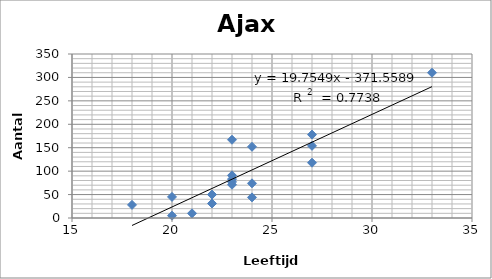
| Category | Series 0 |
|---|---|
| 20.0 | 5 |
| 21.0 | 10 |
| 18.0 | 28 |
| 20.0 | 45 |
| 22.0 | 31 |
| 24.0 | 44 |
| 22.0 | 50 |
| 24.0 | 74 |
| 23.0 | 71 |
| 23.0 | 77 |
| 23.0 | 83 |
| 23.0 | 91 |
| 27.0 | 118 |
| 24.0 | 152 |
| 27.0 | 154 |
| 23.0 | 167 |
| 27.0 | 178 |
| 33.0 | 310 |